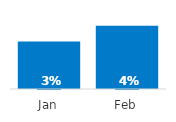
| Category | Employee Turnover Rate |
|---|---|
| Jan | 0.03 |
| Feb | 0.04 |